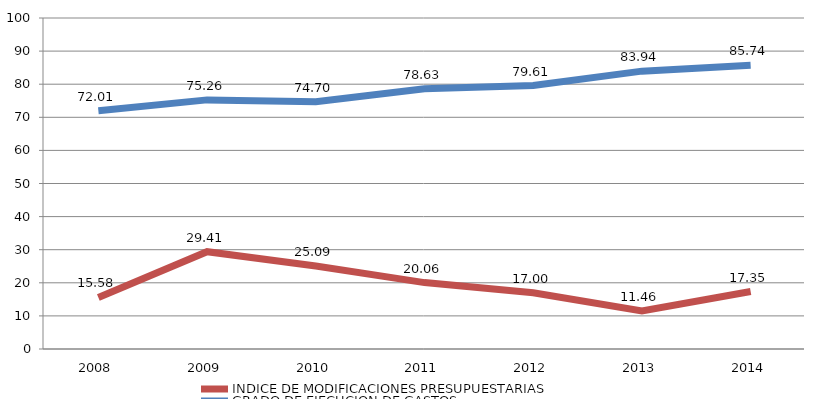
| Category | INDICE DE MODIFICACIONES PRESUPUESTARIAS | GRADO DE EJECUCION DE GASTOS |
|---|---|---|
| 2008.0 | 15.579 | 72.01 |
| 2009.0 | 29.408 | 75.261 |
| 2010.0 | 25.086 | 74.702 |
| 2011.0 | 20.063 | 78.626 |
| 2012.0 | 16.999 | 79.605 |
| 2013.0 | 11.462 | 83.941 |
| 2014.0 | 17.354 | 85.741 |